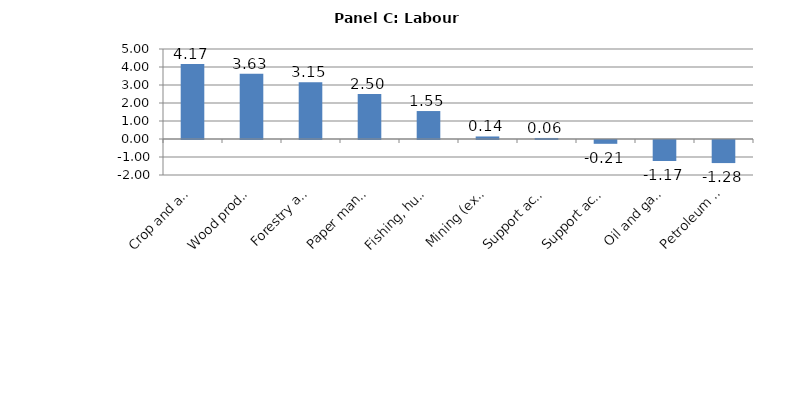
| Category | Series 0 |
|---|---|
| Crop and animal production | 4.167 |
| Wood product manufacturing | 3.63 |
| Forestry and logging | 3.151 |
| Paper manufacturing | 2.497 |
| Fishing, hunting and trapping | 1.553 |
| Mining (except oil and gas) | 0.14 |
| Support activities for agriculture and forestry | 0.057 |
| Support activities for mining and oil and gas | -0.212 |
| Oil and gas extraction | -1.166 |
| Petroleum and coal products manufacturing | -1.282 |